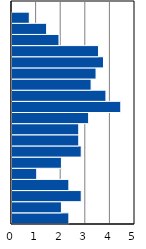
| Category | Series 0 |
|---|---|
| 0-4 | 2.312 |
| 5-9 | 2.01 |
| 10-14 | 2.814 |
| 15-19 | 2.312 |
| 20-24 | 1.005 |
| 25-29 | 2.01 |
| 30-34 | 2.814 |
| 35-39 | 2.714 |
| 40-44 | 2.714 |
| 45-49 | 3.116 |
| 50-54 | 4.422 |
| 55-59 | 3.819 |
| 60-64 | 3.216 |
| 65-69 | 3.417 |
| 70-74 | 3.719 |
| 75-79 | 3.518 |
| 80-84 | 1.91 |
| 85-89 | 1.407 |
| 90-94 | 0.704 |
| 95+ | 0 |